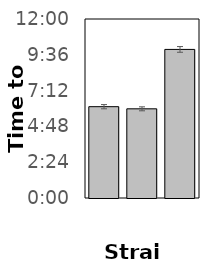
| Category | Series 0 |
|---|---|
| 0 | 0.255 |
| 1 | 0.249 |
| 2 | 0.415 |